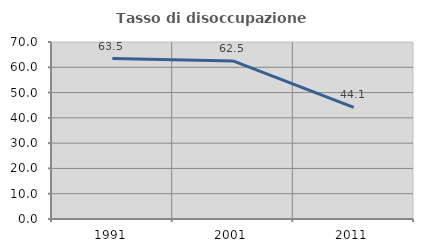
| Category | Tasso di disoccupazione giovanile  |
|---|---|
| 1991.0 | 63.462 |
| 2001.0 | 62.5 |
| 2011.0 | 44.118 |